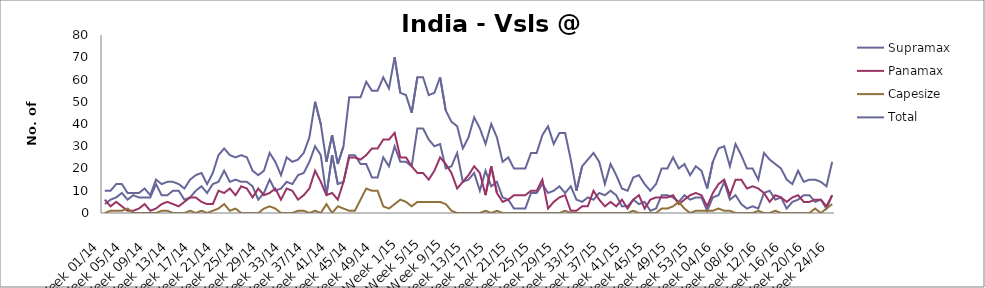
| Category | Supramax | Panamax | Capesize | Total |
|---|---|---|---|---|
| Week 01/14 | 4 | 6 | 0 | 10 |
| Week 02/14 | 6 | 3 | 1 | 10 |
| Week 03/14 | 7 | 5 | 1 | 13 |
| Week 04/14 | 9 | 3 | 1 | 13 |
| Week 05/14 | 6 | 1 | 2 | 9 |
| Week 06/14 | 8 | 1 | 0 | 9 |
| Week 07/14 | 7 | 2 | 0 | 9 |
| Week 08/14 | 7 | 4 | 0 | 11 |
| Week 09/14 | 7 | 1 | 0 | 8 |
| Week 10/14 | 13 | 2 | 0 | 15 |
| Week 11/14 | 8 | 4 | 1 | 13 |
| Week 12/14 | 8 | 5 | 1 | 14 |
| Week 13/14 | 10 | 4 | 0 | 14 |
| Week 14/14 | 10 | 3 | 0 | 13 |
| Week 15/14 | 6 | 5 | 0 | 11 |
| Week 16/14 | 7 | 7 | 1 | 15 |
| Week 17/14 | 10 | 7 | 0 | 17 |
| Week 18/14 | 12 | 5 | 1 | 18 |
| Week 19/14 | 9 | 4 | 0 | 13 |
| Week 20/14 | 13 | 4 | 1 | 18 |
| Week 21/14 | 14 | 10 | 2 | 26 |
| Week 22/14 | 19 | 9 | 4 | 29 |
| Week 23/14 | 14 | 11 | 1 | 26 |
| Week 24/14 | 15 | 8 | 2 | 25 |
| Week 25/14 | 14 | 12 | 0 | 26 |
| Week 26/14 | 14 | 11 | 0 | 25 |
| Week 27/14 | 12 | 7 | 0 | 19 |
| Week 28/14 | 6 | 11 | 0 | 17 |
| Week 29/14 | 9 | 8 | 2 | 19 |
| Week 30/14 | 15 | 9 | 3 | 27 |
| Week 31/14 | 10 | 11 | 2 | 23 |
| Week 32/14 | 11 | 6 | 0 | 17 |
| Week 33/14 | 14 | 11 | 0 | 25 |
| Week 34/14 | 13 | 10 | 0 | 23 |
| Week 35/14 | 17 | 6 | 1 | 24 |
| Week 36/14 | 18 | 8 | 1 | 27 |
| Week 37/14 | 23 | 11 | 0 | 34 |
| Week 38/14 | 30 | 19 | 1 | 50 |
| Week 39/14 | 26 | 14 | 0 | 40 |
| Week 40/14 | 8 | 8 | 4 | 23 |
| Week 41/14 | 26 | 9 | 0 | 35 |
| Week 42/14 | 13 | 6 | 3 | 22 |
| Week 43/14 | 14 | 14 | 2 | 30 |
| Week 44/14 | 26 | 25 | 1 | 52 |
| Week 45/14 | 26 | 25 | 1 | 52 |
| Week 46/14 | 22 | 24 | 6 | 52 |
| Week 47/14 | 22 | 26 | 11 | 59 |
| Week 48/14 | 16 | 29 | 10 | 55 |
| Week 49/14 | 16 | 29 | 10 | 55 |
| Week 50/14 | 25 | 33 | 3 | 61 |
| Week 51/14 | 21 | 33 | 2 | 56 |
| Week 52/14 | 30 | 36 | 4 | 70 |
| Week 1/15 | 23 | 25 | 6 | 54 |
| Week 2/15 | 23 | 25 | 5 | 53 |
| Week 3/15 | 21 | 21 | 3 | 45 |
| Week 4/15 | 38 | 18 | 5 | 61 |
| Week 5/15 | 38 | 18 | 5 | 61 |
| Week 6/15 | 33 | 15 | 5 | 53 |
| Week 7/15 | 30 | 19 | 5 | 54 |
| Week 8/15 | 31 | 25 | 5 | 61 |
| Week 9/15 | 20 | 22 | 4 | 46 |
| Week 10/15 | 21 | 18 | 1 | 41 |
| Week 11/15 | 27 | 11 | 0 | 39 |
| Week 12/15 | 14 | 14 | 0 | 29 |
| Week 13/15 | 15 | 17 | 0 | 34 |
| Week 14/15 | 18 | 21 | 0 | 43 |
| Week 15/15 | 10 | 18 | 0 | 38 |
| Week 16/15 | 19 | 8 | 1 | 31 |
| Week 17/15 | 12 | 21 | 0 | 40 |
| Week 18/15 | 14 | 9 | 1 | 34 |
| Week 19/15 | 7 | 5 | 0 | 23 |
| Week 20/15 | 6 | 6 | 0 | 25 |
| Week 21/15 | 2 | 8 | 0 | 20 |
| Week 22/15 | 2 | 8 | 0 | 20 |
| Week 23/15 | 2 | 8 | 0 | 20 |
| Week 24/15 | 9 | 10 | 0 | 27 |
| Week 25/15 | 9 | 10 | 0 | 27 |
| Week 26/15 | 13 | 15 | 0 | 35 |
| Week 27/15 | 9 | 2 | 0 | 39 |
| Week 28/15 | 10 | 5 | 0 | 31 |
| Week 29/15 | 12 | 7 | 0 | 36 |
| Week 30/15 | 9 | 8 | 1 | 36 |
| Week 31/15 | 12 | 1 | 0 | 24 |
| Week 32/15 | 6 | 1 | 0 | 10 |
| Week 33/15 | 5 | 3 | 0 | 21 |
| Week 34/15 | 7 | 3 | 0 | 24 |
| Week 35/15 | 6 | 10 | 0 | 27 |
| Week 36/15 | 9 | 6 | 0 | 23 |
| Week 37/15 | 8 | 3 | 0 | 13 |
| Week 38/15 | 10 | 5 | 0 | 22 |
| Week 39/15 | 8 | 3 | 0 | 17 |
| Week 40/15 | 3 | 6 | 0 | 11 |
| Week 41/15 | 3 | 2 | 0 | 10 |
| Week 42/15 | 6 | 6 | 1 | 16 |
| Week 43/15 | 4 | 8 | 0 | 17 |
| Week 44/15 | 5 | 2 | 0 | 13 |
| Week 45/15 | 1 | 6 | 0 | 10 |
| Week 46/15 | 2 | 7 | 0 | 13 |
| Week 47/15 | 8 | 7 | 2 | 20 |
| Week 48/15 | 8 | 7 | 2 | 20 |
| Week 49/15 | 7 | 8 | 3 | 25 |
| Week 50/15 | 5 | 4 | 5 | 20 |
| Week 51/15 | 8 | 6 | 2 | 22 |
| Week 52/15 | 6 | 8 | 0 | 17 |
| Week 53/15 | 7 | 9 | 1 | 21 |
| Week 01/16 | 7 | 8 | 1 | 19 |
| Week 02/16 | 1 | 3 | 1 | 11 |
| Week 03/16 | 7 | 9 | 1 | 23 |
| Week 04/16 | 8 | 13 | 2 | 29 |
| Week 05/16 | 14 | 15 | 1 | 30 |
| Week 06/16 | 6 | 8 | 1 | 21 |
| Week 07/16 | 8 | 15 | 0 | 31 |
| Week 08/16 | 4 | 15 | 0 | 26 |
| Week 09/16 | 2 | 11 | 0 | 20 |
| Week 10/16 | 3 | 12 | 0 | 20 |
| Week 11/16 | 2 | 11 | 1 | 15 |
| Week 12/16 | 9 | 9 | 0 | 27 |
| Week 13/16 | 10 | 5 | 0 | 24 |
| Week 14/16 | 6 | 8 | 1 | 22 |
| Week 15/16 | 7 | 7 | 0 | 20 |
| Week 16/16 | 2 | 5 | 0 | 15 |
| Week 17/16 | 5 | 7 | 0 | 13 |
| Week 18/16 | 6 | 8 | 0 | 19 |
| Week 19/16 | 8 | 5 | 0 | 14 |
| Week 20/16 | 8 | 5 | 0 | 15 |
| Week 21/16 | 5 | 6 | 2 | 15 |
| Week 22/16 | 6 | 6 | 0 | 14 |
| Week 23/16 | 2 | 3 | 2 | 12 |
| Week 24/16 | 8 | 8 | 4 | 23 |